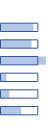
| Category | Series 0 | Series 1 |
|---|---|---|
| 0 | 0.88 | 1 |
| 1 | 0.829 | 1 |
| 2 | 1.22 | 1 |
| 3 | 0.146 | 1 |
| 4 | 0.225 | 1 |
| 5 | 0.547 | 1 |